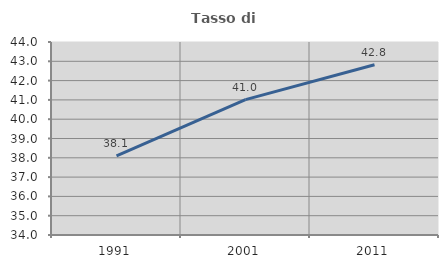
| Category | Tasso di occupazione   |
|---|---|
| 1991.0 | 38.098 |
| 2001.0 | 41.014 |
| 2011.0 | 42.818 |